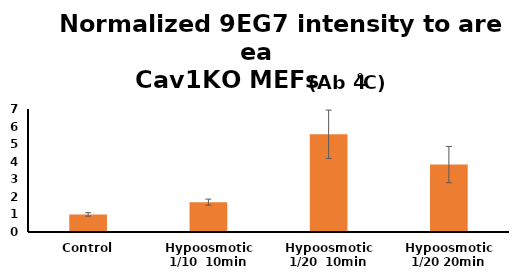
| Category | Cav1KO MEFs |
|---|---|
| Control | 1 |
| Hypoosmotic 1/10  10min | 1.7 |
| Hypoosmotic 1/20  10min | 5.561 |
| Hypoosmotic 1/20 20min | 3.836 |